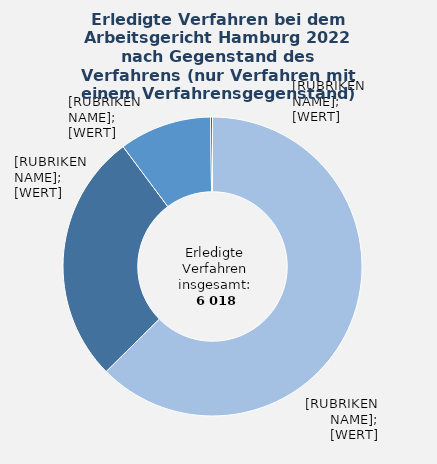
| Category | in Prozent |
|---|---|
| Bestandsstreitigkeiten (insbesondere Kündigungen) | 62.6 |
| Zahlungsklagen | 27.2 |
| Sonstiges | 10 |
| Tarifliche Eingruppierung | 0.2 |